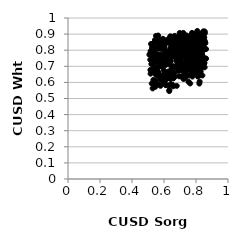
| Category | Series 0 |
|---|---|
| 0.5457226578914693 | 0.861 |
| 0.5820415566814895 | 0.7 |
| 0.6574451764975326 | 0.762 |
| 0.6752550594382059 | 0.841 |
| 0.7130549381380016 | 0.827 |
| 0.5505754176995341 | 0.646 |
| 0.7488513275881186 | 0.699 |
| 0.8416256582278505 | 0.906 |
| 0.723683260445533 | 0.631 |
| 0.7935257288644972 | 0.749 |
| 0.693018027354305 | 0.793 |
| 0.784467930927218 | 0.862 |
| 0.8117410290243743 | 0.802 |
| 0.6580849766439321 | 0.768 |
| 0.7692660674586399 | 0.744 |
| 0.6405592007420011 | 0.768 |
| 0.7277209901649628 | 0.846 |
| 0.7744196884114483 | 0.755 |
| 0.668613444816808 | 0.853 |
| 0.7392412906544054 | 0.798 |
| 0.689508161379329 | 0.747 |
| 0.731924884660142 | 0.823 |
| 0.8248937572480575 | 0.787 |
| 0.5148524658414562 | 0.677 |
| 0.5641696275729025 | 0.874 |
| 0.8037513007634838 | 0.822 |
| 0.7483759412593186 | 0.787 |
| 0.5663074692521712 | 0.66 |
| 0.5499941879436182 | 0.652 |
| 0.7121200630051845 | 0.766 |
| 0.7058212405791672 | 0.802 |
| 0.5937035099978996 | 0.871 |
| 0.8291260168941896 | 0.669 |
| 0.5570148817277782 | 0.865 |
| 0.7141468487834657 | 0.76 |
| 0.6580584887409366 | 0.625 |
| 0.6399307540311069 | 0.882 |
| 0.6925681058426278 | 0.676 |
| 0.7614702906040478 | 0.709 |
| 0.5578501910818092 | 0.823 |
| 0.5394427603922205 | 0.794 |
| 0.7743932370819626 | 0.757 |
| 0.7220183729899539 | 0.829 |
| 0.5455888965109581 | 0.788 |
| 0.7817488615426387 | 0.756 |
| 0.8150313525948676 | 0.713 |
| 0.5501655988925712 | 0.889 |
| 0.5779119782322806 | 0.762 |
| 0.8177974553196619 | 0.859 |
| 0.7369173507866649 | 0.718 |
| 0.5996876197299047 | 0.863 |
| 0.8232861234015729 | 0.729 |
| 0.5421583549383685 | 0.776 |
| 0.8203063983397311 | 0.851 |
| 0.7432944801690256 | 0.785 |
| 0.8026722654339411 | 0.726 |
| 0.7324021082682642 | 0.807 |
| 0.8232832348045411 | 0.771 |
| 0.5556463949286581 | 0.855 |
| 0.7620896380337474 | 0.816 |
| 0.6223724156518007 | 0.728 |
| 0.6401315556109933 | 0.845 |
| 0.8311983168125705 | 0.741 |
| 0.6127117955059027 | 0.583 |
| 0.6096722874639363 | 0.585 |
| 0.571638113350313 | 0.834 |
| 0.8207566657600132 | 0.883 |
| 0.6554024281387867 | 0.762 |
| 0.5907336533650455 | 0.742 |
| 0.6015353490839019 | 0.634 |
| 0.7043214704565222 | 0.867 |
| 0.7778187052440948 | 0.636 |
| 0.589962655403742 | 0.812 |
| 0.6125058261240378 | 0.627 |
| 0.6810460499648323 | 0.73 |
| 0.5351386777890065 | 0.748 |
| 0.7046044673771751 | 0.739 |
| 0.8560215062351673 | 0.853 |
| 0.8112118226193524 | 0.7 |
| 0.7696481851082584 | 0.736 |
| 0.73460007247253 | 0.669 |
| 0.8223389512555741 | 0.886 |
| 0.8090318014074852 | 0.797 |
| 0.7556542803738591 | 0.713 |
| 0.7200901535938342 | 0.845 |
| 0.6028327518208085 | 0.65 |
| 0.6498979735421571 | 0.883 |
| 0.8286975612409831 | 0.691 |
| 0.6349791255831567 | 0.749 |
| 0.8113693694834748 | 0.797 |
| 0.6089561161708308 | 0.653 |
| 0.8064496722266732 | 0.899 |
| 0.8414270815792777 | 0.764 |
| 0.5948114404613527 | 0.805 |
| 0.8351740172883895 | 0.777 |
| 0.8470185200196598 | 0.914 |
| 0.5286461403371234 | 0.681 |
| 0.836226499715456 | 0.775 |
| 0.7889180925463773 | 0.731 |
| 0.6964362518172005 | 0.74 |
| 0.704740798943889 | 0.637 |
| 0.6874071028220665 | 0.794 |
| 0.6327013951077701 | 0.546 |
| 0.6667462719494607 | 0.889 |
| 0.7718375700217853 | 0.857 |
| 0.5855870259741989 | 0.84 |
| 0.5994315803905712 | 0.819 |
| 0.6686731617542627 | 0.783 |
| 0.7056628581224103 | 0.767 |
| 0.8226938736839762 | 0.605 |
| 0.7991582025080584 | 0.884 |
| 0.6792116834227808 | 0.77 |
| 0.6097799660327874 | 0.791 |
| 0.7067010526190458 | 0.839 |
| 0.7880500071993324 | 0.9 |
| 0.6070274973598637 | 0.771 |
| 0.6797144303513258 | 0.579 |
| 0.8060280911832491 | 0.773 |
| 0.5944923998553302 | 0.711 |
| 0.7055036387190643 | 0.711 |
| 0.5167144154654271 | 0.795 |
| 0.7684431915546811 | 0.705 |
| 0.8301815004301825 | 0.799 |
| 0.7358644083941208 | 0.658 |
| 0.6355770242712496 | 0.797 |
| 0.5998937174973021 | 0.816 |
| 0.6610690526595713 | 0.817 |
| 0.5443224519067439 | 0.865 |
| 0.8250639963311653 | 0.647 |
| 0.6343441347901457 | 0.647 |
| 0.8542204190350994 | 0.694 |
| 0.8009249630894547 | 0.823 |
| 0.701712464511115 | 0.684 |
| 0.5968407545011762 | 0.726 |
| 0.8092134369510031 | 0.739 |
| 0.7751363434336973 | 0.743 |
| 0.7703977460090834 | 0.758 |
| 0.602412143621385 | 0.821 |
| 0.7293454715185994 | 0.896 |
| 0.7326885663684408 | 0.846 |
| 0.8519527553697637 | 0.862 |
| 0.74429664049625 | 0.857 |
| 0.6589718991559934 | 0.701 |
| 0.6074626190114201 | 0.727 |
| 0.7303092911457154 | 0.812 |
| 0.5316798145948454 | 0.713 |
| 0.8498805345270116 | 0.91 |
| 0.7037756386627636 | 0.861 |
| 0.6279858290744565 | 0.646 |
| 0.6306680831892935 | 0.582 |
| 0.7923426204302795 | 0.768 |
| 0.5783801617728314 | 0.579 |
| 0.8329304098219796 | 0.69 |
| 0.7157899061074547 | 0.792 |
| 0.6941806884987283 | 0.638 |
| 0.8140350888670429 | 0.79 |
| 0.7528574969121704 | 0.821 |
| 0.7289511681770138 | 0.842 |
| 0.6975802560361317 | 0.866 |
| 0.6545090825566181 | 0.847 |
| 0.5300046211152594 | 0.671 |
| 0.569470798504409 | 0.771 |
| 0.7923019704914944 | 0.695 |
| 0.7821448947220843 | 0.763 |
| 0.8240041782040589 | 0.862 |
| 0.6335262740235029 | 0.553 |
| 0.5382240039686249 | 0.605 |
| 0.7232030528612523 | 0.846 |
| 0.8398929430815486 | 0.643 |
| 0.6221200860546816 | 0.865 |
| 0.756617127246918 | 0.746 |
| 0.5619085718854187 | 0.766 |
| 0.6217228319325869 | 0.847 |
| 0.7891260018829774 | 0.762 |
| 0.7090840532613476 | 0.711 |
| 0.7295319007173267 | 0.852 |
| 0.5199076824365112 | 0.771 |
| 0.6633647408142589 | 0.659 |
| 0.7012200201920786 | 0.888 |
| 0.738580813105093 | 0.742 |
| 0.6181598579368397 | 0.639 |
| 0.5682464536808958 | 0.843 |
| 0.8208228289320129 | 0.593 |
| 0.8128115952784443 | 0.889 |
| 0.7990016938769943 | 0.751 |
| 0.7859702391100623 | 0.826 |
| 0.5933946993905561 | 0.713 |
| 0.5246550163250101 | 0.816 |
| 0.8504443894310971 | 0.882 |
| 0.717387376320967 | 0.761 |
| 0.5925338079033657 | 0.769 |
| 0.6544395240370471 | 0.584 |
| 0.7444861998617047 | 0.678 |
| 0.6062955457466427 | 0.73 |
| 0.8227783438375249 | 0.743 |
| 0.8115050081394497 | 0.636 |
| 0.639344223111258 | 0.622 |
| 0.6884022729648416 | 0.672 |
| 0.7932472437931712 | 0.778 |
| 0.6936436006363742 | 0.869 |
| 0.7351775159769071 | 0.697 |
| 0.6458138273778244 | 0.639 |
| 0.6795080404202227 | 0.864 |
| 0.7215914135102182 | 0.811 |
| 0.6932193575462688 | 0.802 |
| 0.6368434859051253 | 0.657 |
| 0.514160042493545 | 0.741 |
| 0.6576041158151178 | 0.576 |
| 0.7621335626045096 | 0.887 |
| 0.6508112078117776 | 0.651 |
| 0.8160065613895429 | 0.665 |
| 0.7100015617056175 | 0.677 |
| 0.7337705860979025 | 0.876 |
| 0.780740160797371 | 0.821 |
| 0.6907962252388742 | 0.801 |
| 0.6647489516856484 | 0.864 |
| 0.5086555845352292 | 0.772 |
| 0.5357004068542792 | 0.755 |
| 0.7504082187276574 | 0.713 |
| 0.7674915398347391 | 0.85 |
| 0.7636605590644167 | 0.593 |
| 0.6737516958858087 | 0.858 |
| 0.6767633985221474 | 0.747 |
| 0.518940205423245 | 0.839 |
| 0.5872910299345999 | 0.641 |
| 0.6963021674334908 | 0.873 |
| 0.5832067026063025 | 0.823 |
| 0.6030994791616044 | 0.597 |
| 0.5734271380362364 | 0.642 |
| 0.7859343229689043 | 0.828 |
| 0.7952599979824492 | 0.701 |
| 0.7629079511370483 | 0.688 |
| 0.5339597305756433 | 0.616 |
| 0.6394139486975694 | 0.793 |
| 0.6206743735486271 | 0.627 |
| 0.704649081712923 | 0.835 |
| 0.784640023093506 | 0.654 |
| 0.7966208826865359 | 0.854 |
| 0.7731501131860025 | 0.883 |
| 0.7709158109155311 | 0.79 |
| 0.7275372221889764 | 0.816 |
| 0.6728059831532607 | 0.873 |
| 0.7489849105715798 | 0.811 |
| 0.5991716594737471 | 0.605 |
| 0.6140034713718365 | 0.643 |
| 0.5729350254615874 | 0.769 |
| 0.7809462646204444 | 0.715 |
| 0.6131688486460309 | 0.618 |
| 0.5541262416540156 | 0.819 |
| 0.7590754828616135 | 0.643 |
| 0.7686598181268046 | 0.792 |
| 0.6145284328812132 | 0.633 |
| 0.5649471984021953 | 0.819 |
| 0.8154574342041097 | 0.664 |
| 0.7598321685517213 | 0.752 |
| 0.8024852557121498 | 0.681 |
| 0.7512012070861279 | 0.851 |
| 0.8484403197536137 | 0.716 |
| 0.8381324836891018 | 0.881 |
| 0.7902770328779133 | 0.816 |
| 0.8055053134197745 | 0.788 |
| 0.7573843003489542 | 0.811 |
| 0.7946716083134628 | 0.818 |
| 0.6563218226363332 | 0.862 |
| 0.7367507521972351 | 0.697 |
| 0.562991837771626 | 0.719 |
| 0.6377966499974312 | 0.843 |
| 0.534723215199524 | 0.843 |
| 0.8430780405204346 | 0.837 |
| 0.6146173753745332 | 0.85 |
| 0.8487587485391697 | 0.801 |
| 0.5388189035339608 | 0.738 |
| 0.7863585402357585 | 0.841 |
| 0.5484373544758774 | 0.691 |
| 0.8276881254261959 | 0.858 |
| 0.6261683226153498 | 0.667 |
| 0.5819251264557938 | 0.84 |
| 0.639377260748907 | 0.886 |
| 0.7419219571911421 | 0.688 |
| 0.6345557596136235 | 0.726 |
| 0.6209920211432634 | 0.746 |
| 0.8164304735037569 | 0.697 |
| 0.7052827385138507 | 0.737 |
| 0.8184236083612763 | 0.885 |
| 0.6857459586856993 | 0.784 |
| 0.5725995342829608 | 0.648 |
| 0.7484029003236523 | 0.812 |
| 0.7030485930250077 | 0.868 |
| 0.5347649882319792 | 0.812 |
| 0.83884792687884 | 0.755 |
| 0.7345890803913315 | 0.634 |
| 0.7226641959422739 | 0.841 |
| 0.7853798380852879 | 0.83 |
| 0.6067636700595906 | 0.71 |
| 0.7185031711311807 | 0.78 |
| 0.7515986636866785 | 0.77 |
| 0.7564218031383423 | 0.731 |
| 0.748161755578695 | 0.8 |
| 0.7202545400793892 | 0.907 |
| 0.5765384960217534 | 0.626 |
| 0.7893576199131072 | 0.816 |
| 0.704768664331455 | 0.825 |
| 0.6482495891239841 | 0.862 |
| 0.8219265795129762 | 0.696 |
| 0.7222598622249133 | 0.621 |
| 0.5881596806969869 | 0.72 |
| 0.6270958874658681 | 0.786 |
| 0.788833704724099 | 0.764 |
| 0.7386394748302694 | 0.781 |
| 0.8607986164784189 | 0.746 |
| 0.5471126083638143 | 0.736 |
| 0.7329926062301941 | 0.769 |
| 0.687914211849169 | 0.842 |
| 0.6859344851542606 | 0.73 |
| 0.7072568770247014 | 0.846 |
| 0.7524439383659012 | 0.844 |
| 0.595269876609414 | 0.856 |
| 0.648290209828648 | 0.676 |
| 0.8515110039284193 | 0.879 |
| 0.8221107040927301 | 0.67 |
| 0.632431793162139 | 0.737 |
| 0.5502608873071357 | 0.734 |
| 0.8086103625012645 | 0.691 |
| 0.7126590128747636 | 0.807 |
| 0.5776132802893417 | 0.808 |
| 0.6125268138490501 | 0.71 |
| 0.5460114812361078 | 0.573 |
| 0.7415865172290823 | 0.704 |
| 0.7276898966704057 | 0.782 |
| 0.756072999874384 | 0.836 |
| 0.6848773386886298 | 0.884 |
| 0.8623340319744193 | 0.748 |
| 0.8288662566513342 | 0.762 |
| 0.6862774990478859 | 0.823 |
| 0.5233252085184212 | 0.593 |
| 0.8384968472326244 | 0.76 |
| 0.6641857316615347 | 0.631 |
| 0.7517861152247981 | 0.785 |
| 0.8551685982709638 | 0.905 |
| 0.5619667239534007 | 0.642 |
| 0.5490399125217993 | 0.61 |
| 0.5877374580250732 | 0.751 |
| 0.6724643111528634 | 0.693 |
| 0.6878997740774873 | 0.738 |
| 0.8067732555838519 | 0.743 |
| 0.7785102826935196 | 0.72 |
| 0.6530151640653311 | 0.807 |
| 0.7322183510233999 | 0.643 |
| 0.8437507226855188 | 0.698 |
| 0.8031920071403675 | 0.745 |
| 0.7734615877287252 | 0.788 |
| 0.5949257550737546 | 0.736 |
| 0.8452284166749936 | 0.836 |
| 0.6564466462804686 | 0.648 |
| 0.7951505244677036 | 0.887 |
| 0.7771679580959236 | 0.802 |
| 0.803768960878066 | 0.665 |
| 0.7815326463132889 | 0.696 |
| 0.5205654076008717 | 0.793 |
| 0.6975652826195327 | 0.79 |
| 0.8237630451235914 | 0.882 |
| 0.7609557866189458 | 0.803 |
| 0.7728266927948604 | 0.658 |
| 0.8358456183676253 | 0.705 |
| 0.6947044286476958 | 0.748 |
| 0.7230436636853336 | 0.716 |
| 0.542821673912655 | 0.595 |
| 0.5455983620161731 | 0.686 |
| 0.8270981264145092 | 0.714 |
| 0.7886069924165007 | 0.796 |
| 0.8048194589147859 | 0.844 |
| 0.7100019668733535 | 0.874 |
| 0.8332790626734656 | 0.745 |
| 0.6371612079947522 | 0.71 |
| 0.6981213424816672 | 0.907 |
| 0.6004887362548237 | 0.837 |
| 0.5948681329729582 | 0.753 |
| 0.7945386025153928 | 0.751 |
| 0.6038277636597874 | 0.719 |
| 0.5161646932606971 | 0.654 |
| 0.7642852394485605 | 0.873 |
| 0.6812570315621067 | 0.843 |
| 0.5636195302312045 | 0.833 |
| 0.5988894712729851 | 0.675 |
| 0.8441713856480073 | 0.848 |
| 0.8277555170974579 | 0.844 |
| 0.8317397841537575 | 0.901 |
| 0.7730419946070501 | 0.859 |
| 0.5733308637842992 | 0.851 |
| 0.8080409108130819 | 0.919 |
| 0.8127897579538365 | 0.847 |
| 0.6608917135635834 | 0.846 |
| 0.7668192420988535 | 0.877 |
| 0.7326467273542978 | 0.838 |
| 0.6894780925548636 | 0.741 |
| 0.6256431335432211 | 0.793 |
| 0.6830829956703457 | 0.821 |
| 0.7227681175314169 | 0.64 |
| 0.5152761588656892 | 0.783 |
| 0.805014000849079 | 0.76 |
| 0.6243712618881774 | 0.852 |
| 0.6576707187331309 | 0.864 |
| 0.8003866148181742 | 0.733 |
| 0.8214052574608272 | 0.811 |
| 0.6692738375777351 | 0.778 |
| 0.7180494660637713 | 0.887 |
| 0.8417731855894902 | 0.719 |
| 0.7479666085831242 | 0.777 |
| 0.797407691792362 | 0.797 |
| 0.5209554661811718 | 0.714 |
| 0.568766243100582 | 0.765 |
| 0.7679479439605994 | 0.705 |
| 0.6442964152067754 | 0.588 |
| 0.6343175806399476 | 0.795 |
| 0.8207034948200621 | 0.832 |
| 0.8625264830718247 | 0.807 |
| 0.6030922292378592 | 0.815 |
| 0.8460924823271722 | 0.917 |
| 0.7583960775258465 | 0.845 |
| 0.6839322880085776 | 0.727 |
| 0.6743234998418219 | 0.79 |
| 0.538954734360251 | 0.671 |
| 0.5692681559365471 | 0.726 |
| 0.7221161839395289 | 0.789 |
| 0.5645242346989107 | 0.743 |
| 0.564062247615388 | 0.587 |
| 0.7635927402921954 | 0.772 |
| 0.6067874550017356 | 0.662 |
| 0.6858620669372756 | 0.873 |
| 0.6794580035734124 | 0.703 |
| 0.5657684694025548 | 0.861 |
| 0.6627981882669833 | 0.643 |
| 0.8256910719862036 | 0.742 |
| 0.5989001749749809 | 0.753 |
| 0.7986508226294127 | 0.844 |
| 0.6456223234780167 | 0.837 |
| 0.8204601310790988 | 0.693 |
| 0.8093472589968301 | 0.806 |
| 0.5606487086831963 | 0.67 |
| 0.85314540720767 | 0.721 |
| 0.563982392568027 | 0.891 |
| 0.6446193186307855 | 0.641 |
| 0.8509242326432214 | 0.814 |
| 0.8480386475083374 | 0.719 |
| 0.5826157152860048 | 0.614 |
| 0.8135316942410126 | 0.739 |
| 0.8587725403675055 | 0.844 |
| 0.5660907290996755 | 0.697 |
| 0.8091661698732484 | 0.718 |
| 0.6923408732149952 | 0.707 |
| 0.7141274026822801 | 0.672 |
| 0.5869258148793042 | 0.772 |
| 0.5289339604368046 | 0.563 |
| 0.5530213752237473 | 0.666 |
| 0.7750162632923847 | 0.908 |
| 0.6068182100727741 | 0.639 |
| 0.8208079241394503 | 0.813 |
| 0.6721725916498051 | 0.769 |
| 0.7339093187652994 | 0.699 |
| 0.7963330858318869 | 0.751 |
| 0.8236703851280207 | 0.847 |
| 0.7660062553136326 | 0.836 |
| 0.7952891356952123 | 0.813 |
| 0.616500215084469 | 0.78 |
| 0.5669306638765448 | 0.862 |
| 0.7508407896840169 | 0.835 |
| 0.8547684890947671 | 0.916 |
| 0.6692511042509663 | 0.781 |
| 0.8278311251026046 | 0.833 |
| 0.6270877386633977 | 0.749 |
| 0.6428706470037526 | 0.732 |
| 0.6390007689024498 | 0.845 |
| 0.6821036136781995 | 0.867 |
| 0.8342446762905811 | 0.883 |
| 0.5889480376004621 | 0.698 |
| 0.6350696125656192 | 0.871 |
| 0.8036715498508952 | 0.685 |
| 0.8262761779174975 | 0.839 |
| 0.7139217201681605 | 0.685 |
| 0.561544528410237 | 0.809 |
| 0.5208693847886294 | 0.742 |
| 0.7440762348824328 | 0.798 |
| 0.8356363368667863 | 0.715 |
| 0.643667801135827 | 0.816 |
| 0.844204745435094 | 0.845 |
| 0.8363012716675765 | 0.712 |
| 0.815700625246143 | 0.895 |
| 0.7755844416859905 | 0.894 |
| 0.7504536177301138 | 0.764 |
| 0.7359931333898126 | 0.633 |
| 0.7512955853304144 | 0.699 |
| 0.7707794230699487 | 0.677 |
| 0.7423476848670729 | 0.891 |
| 0.6402986486824354 | 0.807 |
| 0.7524720671889205 | 0.605 |
| 0.652160844586112 | 0.678 |
| 0.6433733865118858 | 0.814 |
| 0.6466018636962972 | 0.685 |
| 0.8355596132039821 | 0.903 |
| 0.6887997228145153 | 0.785 |